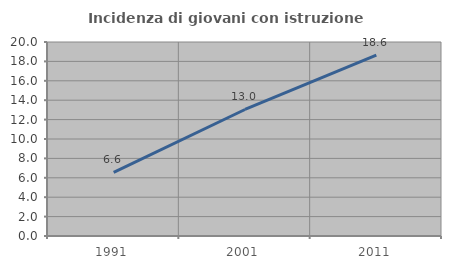
| Category | Incidenza di giovani con istruzione universitaria |
|---|---|
| 1991.0 | 6.557 |
| 2001.0 | 13.043 |
| 2011.0 | 18.644 |